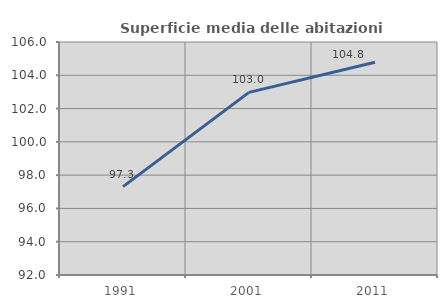
| Category | Superficie media delle abitazioni occupate |
|---|---|
| 1991.0 | 97.312 |
| 2001.0 | 102.972 |
| 2011.0 | 104.783 |